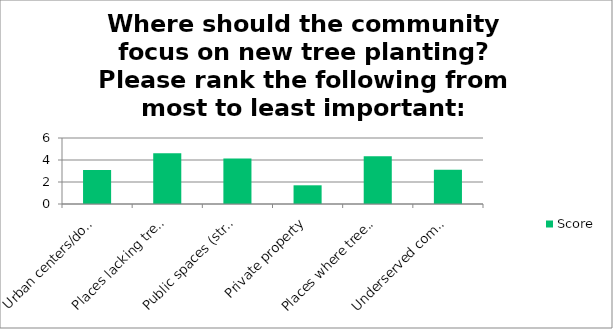
| Category | Score |
|---|---|
| Urban centers/downtown | 3.08 |
| Places lacking trees | 4.62 |
| Public spaces (streets, parks, civic centers, schools) | 4.14 |
| Private property | 1.7 |
| Places where trees would have the greatest environmental benefits | 4.34 |
| Underserved communities | 3.12 |